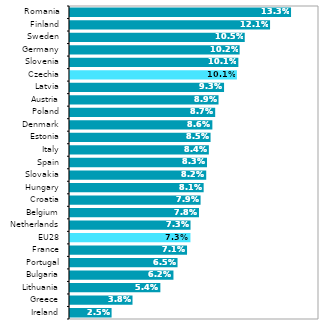
| Category | Series 0 |
|---|---|
| Ireland | 0.025 |
| Greece | 0.038 |
| Lithuania | 0.054 |
| Bulgaria | 0.062 |
| Portugal | 0.065 |
| France | 0.071 |
| EU28 | 0.073 |
| Netherlands | 0.073 |
| Belgium | 0.078 |
| Croatia | 0.079 |
| Hungary | 0.081 |
| Slovakia | 0.082 |
| Spain | 0.083 |
| Italy | 0.084 |
| Estonia | 0.085 |
| Denmark | 0.086 |
| Poland | 0.087 |
| Austria | 0.089 |
| Latvia | 0.093 |
| Czechia | 0.101 |
| Slovenia | 0.101 |
| Germany | 0.102 |
| Sweden | 0.105 |
| Finland | 0.121 |
| Romania | 0.133 |